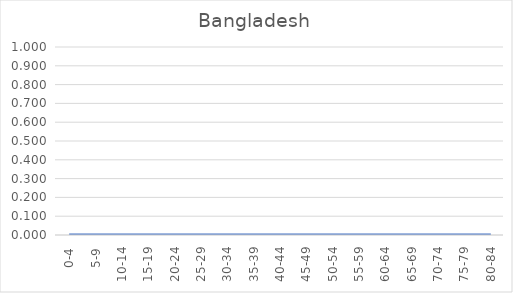
| Category | Series 0 |
|---|---|
| 0-4 | 0 |
| 5-9 | 0 |
| 10-14 | 0 |
| 15-19 | 0 |
| 20-24 | 0 |
| 25-29 | 0 |
| 30-34 | 0 |
| 35-39 | 0 |
| 40-44 | 0 |
| 45-49 | 0 |
| 50-54 | 0 |
| 55-59 | 0 |
| 60-64 | 0 |
| 65-69 | 0 |
| 70-74 | 0 |
| 75-79 | 0 |
| 80-84 | 0 |